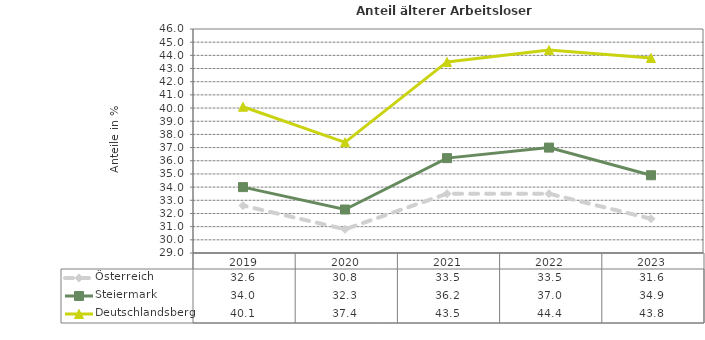
| Category | Österreich | Steiermark | Deutschlandsberg |
|---|---|---|---|
| 2023.0 | 31.6 | 34.9 | 43.8 |
| 2022.0 | 33.5 | 37 | 44.4 |
| 2021.0 | 33.5 | 36.2 | 43.5 |
| 2020.0 | 30.8 | 32.3 | 37.4 |
| 2019.0 | 32.6 | 34 | 40.1 |